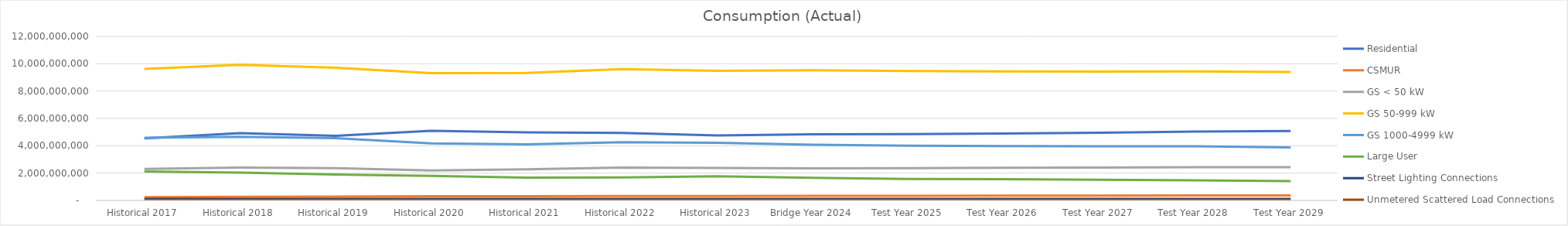
| Category | Residential | CSMUR | GS < 50 kW | GS 50-999 kW | GS 1000-4999 kW | Large User | Street Lighting Connections | Unmetered Scattered Load Connections |
|---|---|---|---|---|---|---|---|---|
| Historical 2017 | 4545714645.058 | 245275380.627 | 2311840421.205 | 9622771102.772 | 4589196039.663 | 2127297945.727 | 115072180.635 | 41404515.489 |
| Historical 2018 | 4927526992.47 | 270836212.458 | 2404335418.466 | 9921831646.948 | 4656922360.701 | 2034120650.822 | 115403896.655 | 40477714.494 |
| Historical 2019 | 4729458671.443 | 277567648.594 | 2367473347.343 | 9711872547.182 | 4554372184.119 | 1896701615.242 | 115091255.126 | 40395663.34 |
| Historical 2020 | 5094828703.168 | 305026830.932 | 2190514000.598 | 9311631673.886 | 4174985520.424 | 1791431051.686 | 115311511.878 | 40389262.893 |
| Historical 2021 | 4976366980.86 | 316584976.336 | 2279331264.239 | 9330978840.66 | 4104076189.941 | 1662798981 | 115326732.801 | 41586125.274 |
| Historical 2022 | 4941071680.996 | 328137410.724 | 2403616498.847 | 9607262360.813 | 4255863824.551 | 1688947009.12 | 118535643.066 | 41993718.68 |
| Historical 2023 | 4753499012.674 | 323617867.922 | 2370809830.785 | 9477043968.898 | 4216596915.576 | 1763642536.797 | 117771219.075 | 42090115.886 |
| Bridge Year 2024 | 4844831653.702 | 336386377.396 | 2349753700.12 | 9529407711.546 | 4071987161.396 | 1651006373.077 | 118298491.948 | 42205431.272 |
| Test Year 2025 | 4854325531.702 | 341855435.812 | 2361358051.849 | 9463360431.857 | 4003003653.933 | 1572179422.701 | 118212158.491 | 42090115.886 |
| Test Year 2026 | 4898252483.665 | 348726395.395 | 2385394366.485 | 9441088041.836 | 3979295922.744 | 1562410517.679 | 118551502.357 | 42090115.886 |
| Test Year 2027 | 4953291539.999 | 355027390.155 | 2407992243.801 | 9422833420.457 | 3959146844.638 | 1513102972.634 | 118890846.222 | 42090115.886 |
| Test Year 2028 | 5031104116.735 | 361653182.764 | 2438740084.826 | 9433820768.498 | 3961643011.002 | 1473456387.368 | 119603593.839 | 42205431.272 |
| Test Year 2029 | 5082273884.996 | 365438177.402 | 2438678482.035 | 9391367514.713 | 3881004361.107 | 1412958802.449 | 119569533.952 | 42090115.886 |